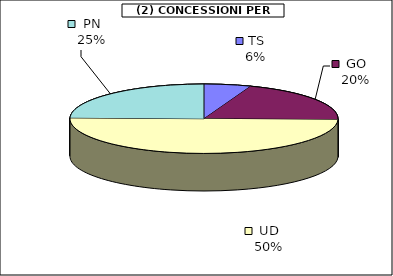
| Category | Series 0 |
|---|---|
| TS | 7042.5 |
| GO | 24555 |
| UD | 61966 |
| PN | 30539.5 |